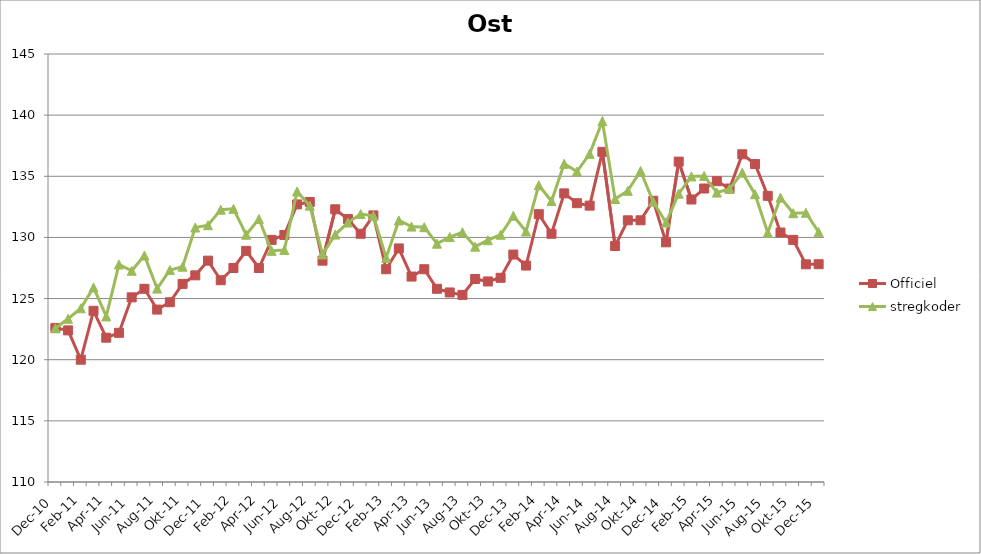
| Category | Officiel | stregkoder |
|---|---|---|
|  Dec-10 | 122.6 | 122.571 |
|  Jan-11 | 122.4 | 123.345 |
|  Feb-11 | 120 | 124.207 |
|  Mar-11 | 124 | 125.911 |
|  Apr-11 | 121.8 | 123.539 |
|  Maj-11 | 122.2 | 127.79 |
|  Jun-11 | 125.1 | 127.272 |
|  Jul-11 | 125.8 | 128.521 |
|  Aug-11 | 124.1 | 125.818 |
|  Sep-11 | 124.7 | 127.333 |
|  Okt-11 | 126.2 | 127.607 |
|  Nov-11 | 126.9 | 130.813 |
|  Dec-11 | 128.1 | 131.001 |
|  Jan-12 | 126.5 | 132.272 |
|  Feb-12 | 127.5 | 132.337 |
|  Mar-12 | 128.9 | 130.22 |
|  Apr-12 | 127.5 | 131.509 |
|  Maj-12 | 129.8 | 128.903 |
|  Jun-12 | 130.2 | 128.978 |
|  Jul-12 | 132.7 | 133.758 |
|  Aug-12 | 132.9 | 132.598 |
|  Sep-12 | 128.1 | 128.613 |
|  Okt-12 | 132.3 | 130.234 |
|  Nov-12 | 131.5 | 131.216 |
|  Dec-12 | 130.3 | 131.914 |
|  Jan-13 | 131.8 | 131.771 |
|  Feb-13 | 127.4 | 128.345 |
|  Mar-13 | 129.1 | 131.391 |
|  Apr-13 | 126.8 | 130.887 |
|  Maj-13 | 127.4 | 130.837 |
|  Jun-13 | 125.8 | 129.489 |
|  Jul-13 | 125.5 | 130.029 |
|  Aug-13 | 125.3 | 130.427 |
|  Sep-13 | 126.6 | 129.247 |
|  Okt-13 | 126.4 | 129.772 |
|  Nov-13 | 126.7 | 130.22 |
|  Dec-13 | 128.6 | 131.773 |
|  Jan-14 | 127.7 | 130.484 |
|  Feb-14 | 131.9 | 134.269 |
|  Mar-14 | 130.3 | 132.974 |
|  Apr-14 | 133.6 | 136.02 |
|  Maj-14 | 132.8 | 135.39 |
|  Jun-14 | 132.6 | 136.838 |
|  Jul-14 | 137 | 139.509 |
|  Aug-14 | 129.3 | 133.143 |
|  Sep-14 | 131.4 | 133.816 |
|  Okt-14 | 131.4 | 135.44 |
|  Nov-14 | 133 | 132.914 |
|  Dec-14 | 129.6 | 131.217 |
|  Jan-15 | 136.2 | 133.575 |
|  Feb-15 | 133.1 | 134.988 |
|  Mar-15 | 134 | 135.023 |
|  Apr-15 | 134.6 | 133.67 |
|  Maj-15 | 134 | 133.967 |
| Jun-15 | 136.8 | 135.297 |
| Jul-15 | 136 | 133.533 |
| Aug-15 | 133.4 | 130.383 |
| Sep-15 | 130.4 | 133.257 |
| Okt-15 | 129.8 | 131.982 |
| Nov-15 | 127.8 | 132.019 |
| Dec-15 | 127.809 | 130.434 |